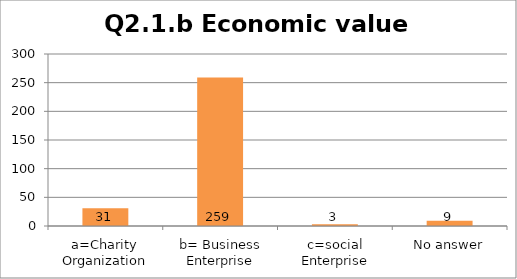
| Category | Q2.1.b Economic value creation |
|---|---|
| a=Charity Organization | 31 |
| b= Business Enterprise | 259 |
| c=social Enterprise | 3 |
| No answer | 9 |